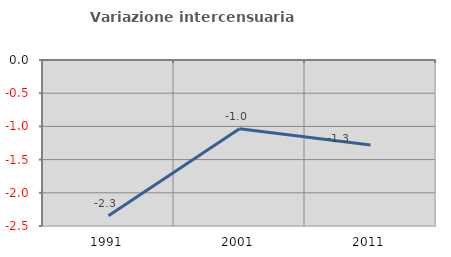
| Category | Variazione intercensuaria annua |
|---|---|
| 1991.0 | -2.345 |
| 2001.0 | -1.035 |
| 2011.0 | -1.28 |